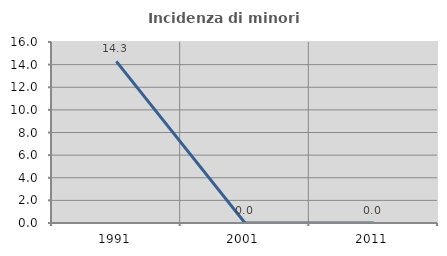
| Category | Incidenza di minori stranieri |
|---|---|
| 1991.0 | 14.286 |
| 2001.0 | 0 |
| 2011.0 | 0 |